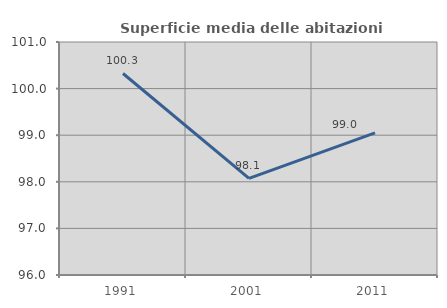
| Category | Superficie media delle abitazioni occupate |
|---|---|
| 1991.0 | 100.325 |
| 2001.0 | 98.075 |
| 2011.0 | 99.05 |